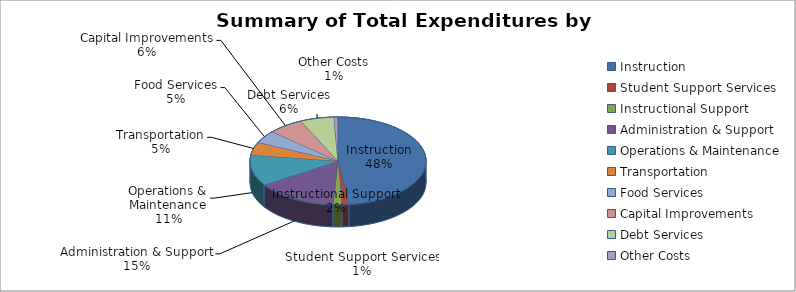
| Category | 2018-2019 |
|---|---|
| Instruction | 1820880 |
| Student Support Services | 48355 |
| Instructional Support | 60055 |
| Administration & Support | 564914 |
| Operations & Maintenance | 431080 |
| Transportation | 180855 |
| Food Services | 174838 |
| Capital Improvements | 245941 |
| Debt Services | 235422 |
| Other Costs | 27788 |